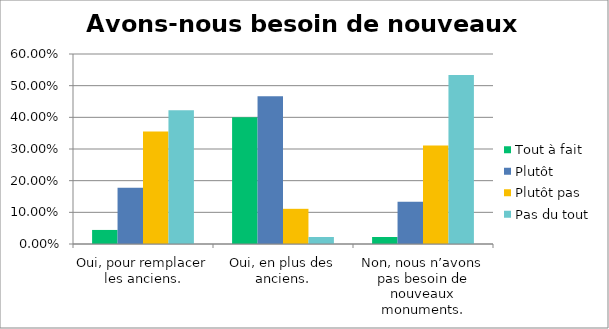
| Category | Tout à fait | Plutôt | Plutôt pas | Pas du tout |
|---|---|---|---|---|
| Oui, pour remplacer les anciens. | 0.044 | 0.178 | 0.356 | 0.422 |
| Oui, en plus des anciens. | 0.4 | 0.467 | 0.111 | 0.022 |
| Non, nous n’avons pas besoin de nouveaux monuments. | 0.022 | 0.133 | 0.311 | 0.533 |